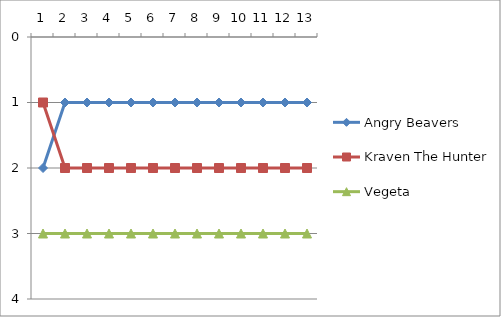
| Category | Angry Beavers | Kraven The Hunter | Vegeta |
|---|---|---|---|
| 0 | 2 | 1 | 3 |
| 1 | 1 | 2 | 3 |
| 2 | 1 | 2 | 3 |
| 3 | 1 | 2 | 3 |
| 4 | 1 | 2 | 3 |
| 5 | 1 | 2 | 3 |
| 6 | 1 | 2 | 3 |
| 7 | 1 | 2 | 3 |
| 8 | 1 | 2 | 3 |
| 9 | 1 | 2 | 3 |
| 10 | 1 | 2 | 3 |
| 11 | 1 | 2 | 3 |
| 12 | 1 | 2 | 3 |